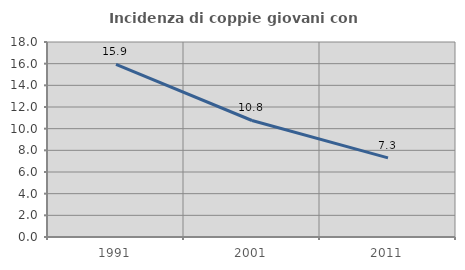
| Category | Incidenza di coppie giovani con figli |
|---|---|
| 1991.0 | 15.935 |
| 2001.0 | 10.754 |
| 2011.0 | 7.305 |